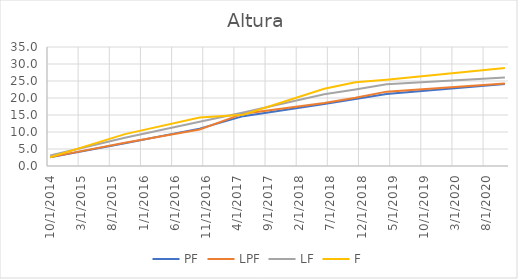
| Category | PF | LPF | LF | F |
|---|---|---|---|---|
| 10/1/14 | 2.538 | 2.607 | 3.1 | 2.568 |
| 10/1/15 | 6.717 | 6.819 | 8.285 | 9.381 |
| 10/1/16 | 10.994 | 10.718 | 13.001 | 14.292 |
| 5/31/17 | 14.663 | 15.399 | 15.724 | 15.079 |
| 6/20/18 | 18.204 | 18.547 | 21.108 | 22.705 |
| 11/15/18 | 19.713 | 20.103 | 22.495 | 24.65 |
| 4/1/19 | 21.151 | 21.871 | 24.065 | 25.369 |
| 11/4/20 | 24.09 | 24.283 | 26.021 | 28.845 |